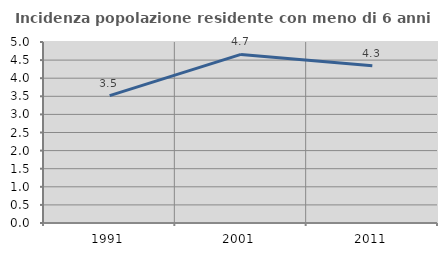
| Category | Incidenza popolazione residente con meno di 6 anni |
|---|---|
| 1991.0 | 3.519 |
| 2001.0 | 4.657 |
| 2011.0 | 4.344 |